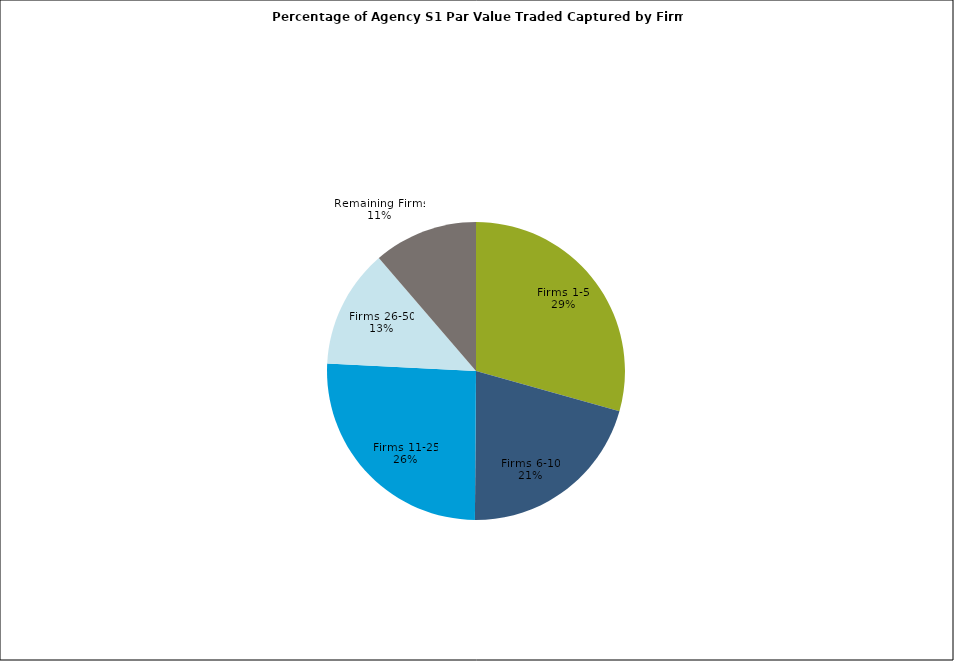
| Category | Series 0 |
|---|---|
| Firms 1-5 | 0.294 |
| Firms 6-10 | 0.208 |
| Firms 11-25 | 0.257 |
| Firms 26-50 | 0.129 |
| Remaining Firms | 0.113 |